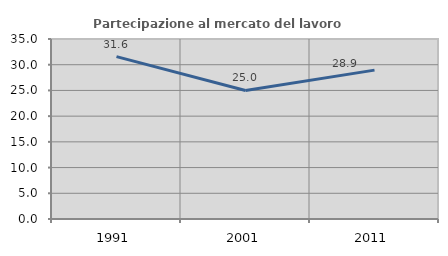
| Category | Partecipazione al mercato del lavoro  femminile |
|---|---|
| 1991.0 | 31.568 |
| 2001.0 | 25 |
| 2011.0 | 28.947 |